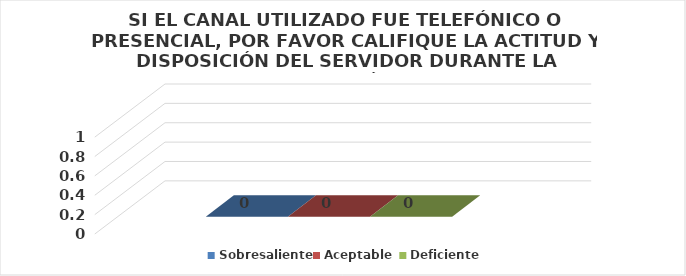
| Category | Sobresaliente | Aceptable  | Deficiente |
|---|---|---|---|
| 0 | 0 | 0 | 0 |